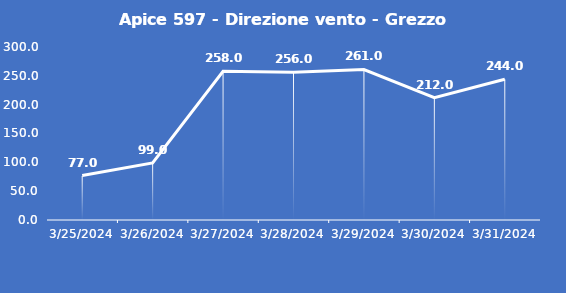
| Category | Apice 597 - Direzione vento - Grezzo (°N) |
|---|---|
| 3/25/24 | 77 |
| 3/26/24 | 99 |
| 3/27/24 | 258 |
| 3/28/24 | 256 |
| 3/29/24 | 261 |
| 3/30/24 | 212 |
| 3/31/24 | 244 |